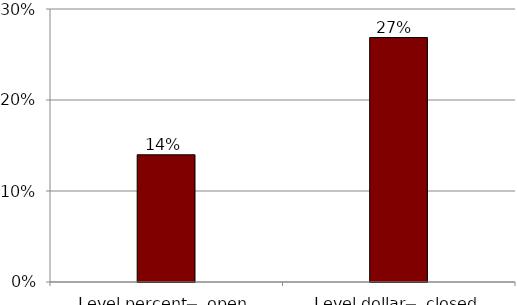
| Category | Series 1 |
|---|---|
| Level percent  ̶  open | 0.14 |
| Level dollar  ̶  closed | 0.269 |